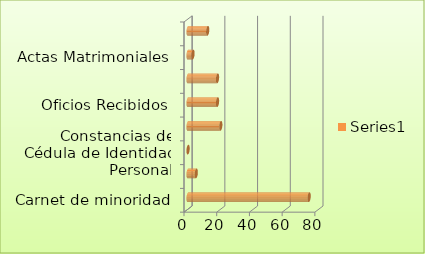
| Category | Series 0 |
|---|---|
| Carnet de minoridad | 74 |
| Constancias de solteria | 5 |
| Constancias de Cédula de Identidad Personal | 0 |
| Constancias varias | 20 |
| Oficios Recibidos | 18 |
| Oficios Despachados | 18 |
| Actas Matrimoniales | 3 |
| Reposicion de Partidas de Nacimiento | 12 |